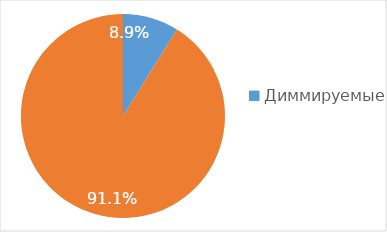
| Category | Доля, % |
|---|---|
| Диммируемые | 0.089 |
| Без диммирования | 0.911 |